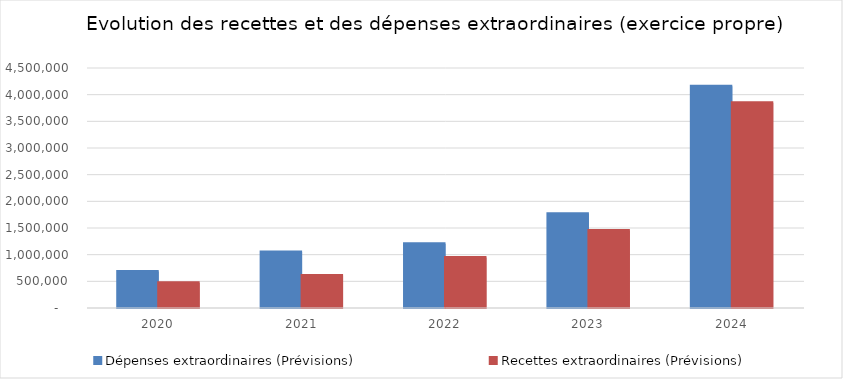
| Category | Dépenses extraordinaires (Prévisions) | Recettes extraordinaires (Prévisions) |
|---|---|---|
| 2020.0 | 683250 | 473350 |
| 2021.0 | 1051767 | 610800 |
| 2022.0 | 1206280.45 | 947100 |
| 2023.0 | 1766406.67 | 1453333.39 |
| 2024.0 | 4157952.2 | 3849859.18 |